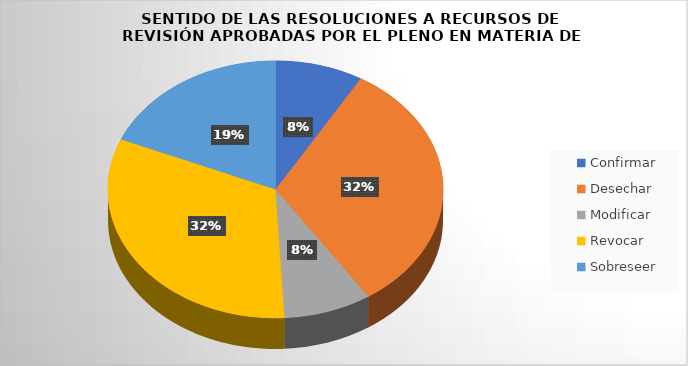
| Category | Series 0 |
|---|---|
| Confirmar | 5 |
| Desechar | 19 |
| Modificar | 5 |
| Revocar | 19 |
| Sobreseer | 11 |